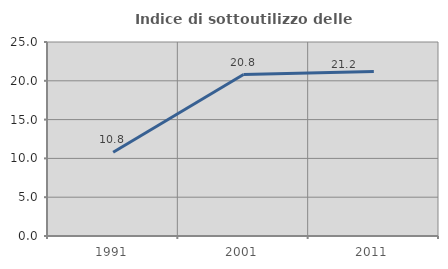
| Category | Indice di sottoutilizzo delle abitazioni  |
|---|---|
| 1991.0 | 10.796 |
| 2001.0 | 20.802 |
| 2011.0 | 21.212 |